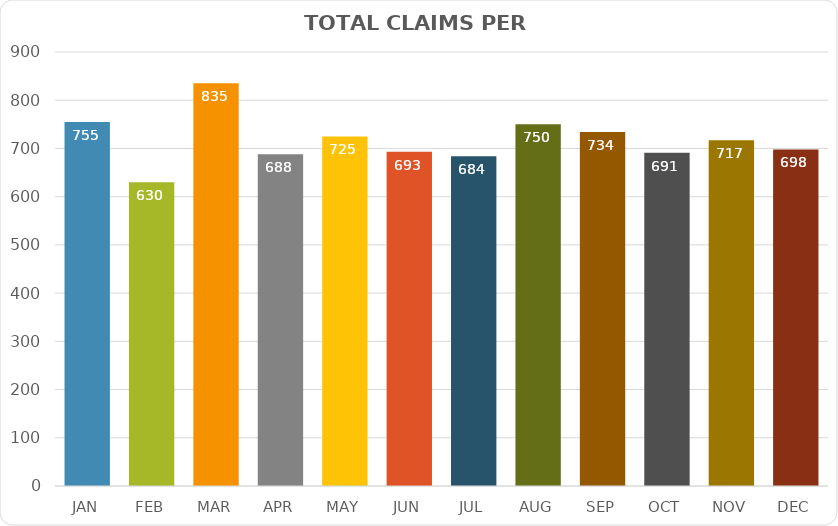
| Category | Series 0 |
|---|---|
| JAN | 755 |
| FEB | 630 |
| MAR | 835 |
| APR | 688 |
| MAY | 725 |
| JUN | 693 |
| JUL | 684 |
| AUG | 750 |
| SEP | 734 |
| OCT | 691 |
| NOV | 717 |
| DEC | 698 |